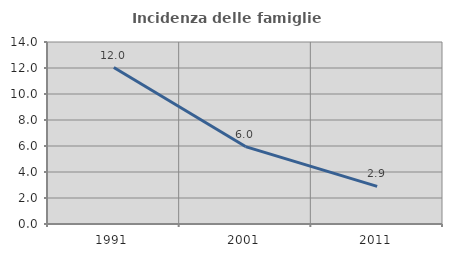
| Category | Incidenza delle famiglie numerose |
|---|---|
| 1991.0 | 12.036 |
| 2001.0 | 5.956 |
| 2011.0 | 2.89 |